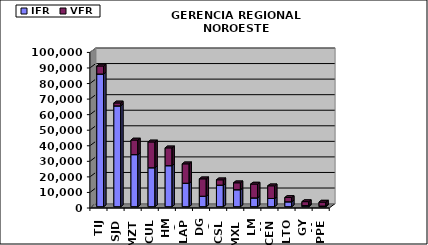
| Category | IFR | VFR |
|---|---|---|
| TIJ | 85287 | 5153 |
| SJD | 64799 | 1880 |
| MZT | 33458 | 9391 |
| CUL | 25037 | 16574 |
| HMO | 26359 | 11442 |
| LAP | 15076 | 12461 |
| DGO | 6736 | 11174 |
| CSL | 13857 | 3412 |
| MXL | 10907 | 4440 |
| LMM | 5642 | 8896 |
| CEN | 5282 | 8138 |
| LTO | 3148 | 2762 |
| GYM | 677 | 2563 |
| PPE | 398 | 2546 |